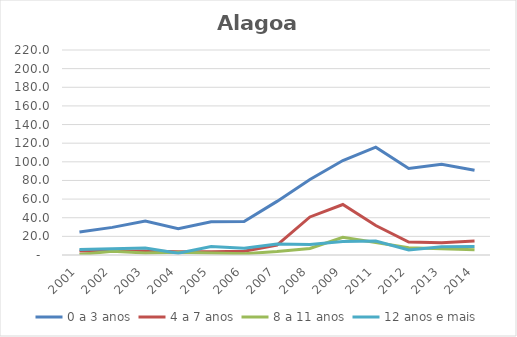
| Category | 0 a 3 anos | 4 a 7 anos | 8 a 11 anos | 12 anos e mais |
|---|---|---|---|---|
| 2001.0 | 24.638 | 4.355 | 0.53 | 5.973 |
| 2002.0 | 29.632 | 3.983 | 3.926 | 6.679 |
| 2003.0 | 36.463 | 4.411 | 2.092 | 7.554 |
| 2004.0 | 28.16 | 3.478 | 2.86 | 2.019 |
| 2005.0 | 35.554 | 3.469 | 2.263 | 9.142 |
| 2006.0 | 35.886 | 4.097 | 1.307 | 7.134 |
| 2007.0 | 57.547 | 10.654 | 3.663 | 11.895 |
| 2008.0 | 80.954 | 40.833 | 7.019 | 11.231 |
| 2009.0 | 101.361 | 54.208 | 19.077 | 14.578 |
| 2011.0 | 115.735 | 31.612 | 13.388 | 14.953 |
| 2012.0 | 92.774 | 13.948 | 7.859 | 5.402 |
| 2013.0 | 97.484 | 13.272 | 6.667 | 8.774 |
| 2014.0 | 90.959 | 15.119 | 5.546 | 9.065 |